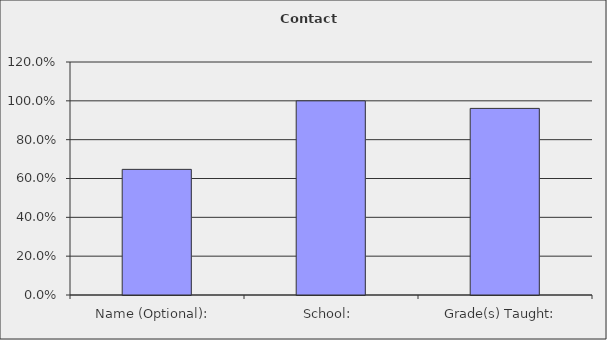
| Category | Series 0 |
|---|---|
| Name (Optional):  | 0.647 |
| School:  | 1 |
| Grade(s) Taught:  | 0.961 |